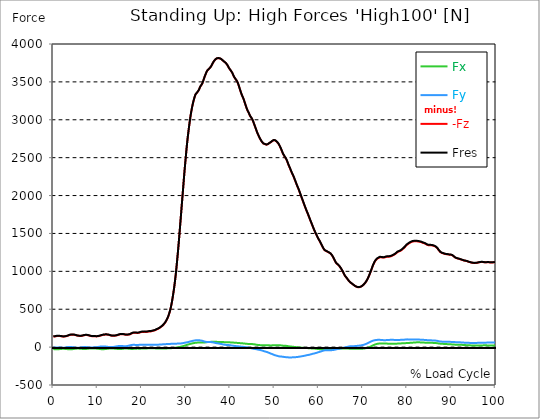
| Category |  Fx |  Fy |  -Fz |  Fres |
|---|---|---|---|---|
| 0.0 | -25.821 | -8.707 | 138.574 | 141.735 |
| 0.167348456675344 | -27.02 | -7.235 | 139.146 | 142.389 |
| 0.334696913350688 | -27.96 | -5.791 | 140.332 | 143.656 |
| 0.5020453700260321 | -28.519 | -5.164 | 142.648 | 146.027 |
| 0.669393826701376 | -29.064 | -4.537 | 144.965 | 148.385 |
| 0.83674228337672 | -29.064 | -3.992 | 145.55 | 148.902 |
| 1.0040907400520642 | -28.437 | -3.665 | 146.177 | 149.352 |
| 1.1621420602454444 | -27.769 | -3.652 | 146.668 | 149.652 |
| 1.3294905169207885 | -26.897 | -4.442 | 146.722 | 149.529 |
| 1.4968389735961325 | -25.521 | -5.873 | 145.755 | 148.385 |
| 1.6641874302714765 | -24.445 | -6.867 | 144.665 | 147.186 |
| 1.8315358869468206 | -23.6 | -7.903 | 142.798 | 145.346 |
| 1.9988843436221646 | -22.932 | -8.761 | 140.795 | 143.411 |
| 2.1662328002975086 | -22.687 | -8.802 | 139.283 | 141.885 |
| 2.333581256972853 | -22.837 | -8.162 | 138.56 | 141.108 |
| 2.5009297136481967 | -23.314 | -6.976 | 139.528 | 142.062 |
| 2.6682781703235405 | -23.75 | -5.6 | 141.408 | 143.915 |
| 2.8356266269988843 | -24.567 | -3.856 | 143.329 | 145.959 |
| 3.002975083674229 | -25.603 | -2.207 | 145.441 | 148.207 |
| 3.1703235403495724 | -26.734 | -0.763 | 147.853 | 150.715 |
| 3.337671997024917 | -28.069 | 0.804 | 151.805 | 154.83 |
| 3.4957233172182973 | -29.255 | 2.017 | 156.41 | 159.585 |
| 3.663071773893641 | -29.677 | 2.589 | 159.721 | 162.978 |
| 3.8304202305689854 | -29.582 | 2.425 | 162.256 | 165.444 |
| 3.997768687244329 | -28.914 | 1.567 | 163.509 | 166.589 |
| 4.165117143919673 | -28.11 | 0.6 | 164.422 | 167.352 |
| 4.332465600595017 | -27.115 | -0.586 | 164.831 | 167.611 |
| 4.499814057270361 | -25.794 | -2.139 | 164.409 | 167.038 |
| 4.667162513945706 | -24.363 | -3.911 | 163.468 | 165.962 |
| 4.834510970621049 | -22.823 | -5.845 | 161.493 | 163.877 |
| 5.001859427296393 | -21.447 | -7.59 | 158.945 | 161.288 |
| 5.169207883971737 | -20.616 | -8.584 | 156.001 | 158.345 |
| 5.336556340647081 | -19.798 | -9.334 | 152.922 | 155.266 |
| 5.503904797322425 | -19.485 | -9.415 | 151.042 | 153.385 |
| 5.671253253997769 | -19.553 | -9.075 | 149.516 | 151.846 |
| 5.82930457419115 | -20.03 | -8.175 | 148.357 | 150.674 |
| 5.996653030866494 | -20.684 | -7.031 | 147.499 | 149.829 |
| 6.164001487541838 | -21.529 | -5.573 | 147.513 | 149.897 |
| 6.331349944217181 | -22.333 | -4.183 | 148.248 | 150.728 |
| 6.498698400892526 | -23.45 | -2.439 | 149.774 | 152.391 |
| 6.66604685756787 | -24.499 | -0.981 | 152.282 | 155.061 |
| 6.833395314243213 | -25.085 | 0.164 | 154.898 | 157.909 |
| 7.000743770918558 | -25.576 | 1.226 | 157.446 | 160.661 |
| 7.168092227593902 | -25.548 | 1.54 | 158.727 | 161.915 |
| 7.335440684269246 | -24.813 | 1.049 | 159.367 | 162.419 |
| 7.50278914094459 | -23.395 | -0.191 | 159.544 | 162.392 |
| 7.6701375976199335 | -22.183 | -1.581 | 158.658 | 161.37 |
| 7.837486054295278 | -20.997 | -3.27 | 156.846 | 159.462 |
| 7.995537374488658 | -19.921 | -4.551 | 154.557 | 157.037 |
| 8.162885831164003 | -18.667 | -5.9 | 151.164 | 153.631 |
| 8.330234287839346 | -17.768 | -6.677 | 148.357 | 150.824 |
| 8.49758274451469 | -17.55 | -6.554 | 146.518 | 149.011 |
| 8.664931201190035 | -17.754 | -5.805 | 144.406 | 146.913 |
| 8.832279657865378 | -18.041 | -4.919 | 143.343 | 145.932 |
| 8.999628114540721 | -18.599 | -3.597 | 142.962 | 145.632 |
| 9.166976571216066 | -19.43 | -2.194 | 143.616 | 146.3 |
| 9.334325027891412 | -19.975 | -1.349 | 144.678 | 147.376 |
| 9.501673484566755 | -19.621 | -1.812 | 143.316 | 145.959 |
| 9.669021941242098 | -19.798 | -1.935 | 141.476 | 144.201 |
| 9.836370397917442 | -20.643 | -0.559 | 141.476 | 144.351 |
| 10.003718854592787 | -21.447 | 0.967 | 142.58 | 145.55 |
| 10.17106731126813 | -22.442 | 2.562 | 144.324 | 147.404 |
| 10.329118631461512 | -23.627 | 4.278 | 146.45 | 149.679 |
| 10.496467088136853 | -25.031 | 5.873 | 149.093 | 152.486 |
| 10.663815544812199 | -26.488 | 7.276 | 152.05 | 155.661 |
| 10.831164001487544 | -27.129 | 7.971 | 154.979 | 158.658 |
| 10.998512458162887 | -27.701 | 8.666 | 157.718 | 161.452 |
| 11.16586091483823 | -27.974 | 9.129 | 160.253 | 164 |
| 11.333209371513574 | -27.715 | 9.061 | 162.337 | 166.016 |
| 11.50055782818892 | -27.197 | 8.761 | 163.932 | 167.488 |
| 11.667906284864264 | -26.121 | 7.903 | 164.667 | 168.019 |
| 11.835254741539607 | -25.071 | 7.14 | 165.212 | 168.374 |
| 12.00260319821495 | -23.94 | 6.132 | 165.553 | 168.523 |
| 12.169951654890292 | -22.701 | 4.851 | 165.308 | 168.087 |
| 12.337300111565641 | -21.297 | 3.161 | 164.395 | 167.011 |
| 12.504648568240984 | -19.962 | 1.376 | 162.555 | 165.076 |
| 12.662699888434362 | -19.103 | 0.3 | 159.435 | 161.969 |
| 12.830048345109708 | -18.558 | -0.082 | 155.811 | 158.318 |
| 12.997396801785053 | -18.204 | -0.245 | 152.772 | 155.252 |
| 13.164745258460396 | -18.163 | 0.095 | 151.192 | 153.631 |
| 13.33209371513574 | -18.299 | 0.749 | 150.497 | 152.881 |
| 13.499442171811083 | -18.831 | 1.826 | 150.415 | 152.813 |
| 13.666790628486426 | -19.567 | 3.039 | 150.728 | 153.181 |
| 13.834139085161771 | -20.275 | 4.592 | 151.287 | 153.849 |
| 14.001487541837117 | -21.106 | 6.159 | 151.587 | 154.298 |
| 14.16883599851246 | -22.142 | 7.944 | 152.908 | 155.797 |
| 14.336184455187803 | -23.355 | 9.906 | 155.048 | 158.154 |
| 14.503532911863147 | -24.622 | 11.895 | 157.609 | 160.975 |
| 14.670881368538492 | -25.794 | 13.476 | 161.016 | 164.627 |
| 14.828932688731873 | -26.475 | 14.511 | 164.436 | 168.128 |
| 14.996281145407215 | -26.502 | 14.988 | 167.365 | 170.99 |
| 15.163629602082558 | -26.039 | 15.356 | 169.314 | 172.816 |
| 15.330978058757903 | -25.112 | 15.22 | 170.486 | 173.769 |
| 15.498326515433247 | -23.913 | 14.62 | 170.99 | 174.015 |
| 15.665674972108594 | -22.428 | 13.585 | 170.744 | 173.511 |
| 15.833023428783937 | -20.807 | 12.304 | 169.723 | 172.175 |
| 16.00037188545928 | -19.757 | 11.732 | 167.938 | 170.254 |
| 16.167720342134626 | -19.09 | 11.487 | 165.962 | 168.196 |
| 16.335068798809967 | -18.722 | 11.541 | 164.136 | 166.343 |
| 16.502417255485312 | -18.817 | 12.359 | 163.291 | 165.58 |
| 16.669765712160658 | -19.294 | 13.953 | 163.455 | 165.948 |
| 16.837114168836 | -19.975 | 15.983 | 164.068 | 166.834 |
| 17.004462625511344 | -20.793 | 18.259 | 165.185 | 168.292 |
| 17.16251394570472 | -21.692 | 20.738 | 166.684 | 170.172 |
| 17.32986240238007 | -22.728 | 23.15 | 168.837 | 172.734 |
| 17.497210859055414 | -23.736 | 25.644 | 172.829 | 177.162 |
| 17.664559315730756 | -24.213 | 28.178 | 179.601 | 184.234 |
| 17.8319077724061 | -24.118 | 29.5 | 183.703 | 188.417 |
| 17.999256229081443 | -23.75 | 30.222 | 186.891 | 191.592 |
| 18.166604685756788 | -23.218 | 30.317 | 188.649 | 193.282 |
| 18.333953142432133 | -22.455 | 29.936 | 189.48 | 194.017 |
| 18.501301599107478 | -21.338 | 28.928 | 189.507 | 193.867 |
| 18.668650055782823 | -20.616 | 28.396 | 188.104 | 192.382 |
| 18.835998512458165 | -19.975 | 27.974 | 186.564 | 190.774 |
| 19.00334696913351 | -19.676 | 28.164 | 186.537 | 190.693 |
| 19.170695425808855 | -19.853 | 28.873 | 187.954 | 192.11 |
| 19.338043882484197 | -20.234 | 29.704 | 189.439 | 193.677 |
| 19.496095202677576 | -20.098 | 30.345 | 192.246 | 196.579 |
| 19.66344365935292 | -20.262 | 31.585 | 195.448 | 200.054 |
| 19.830792116028263 | -20.016 | 32.307 | 198.037 | 202.792 |
| 19.998140572703612 | -19.076 | 31.775 | 199.999 | 204.659 |
| 20.165489029378953 | -18.64 | 31.476 | 200.285 | 204.877 |
| 20.3328374860543 | -18.695 | 31.694 | 200.163 | 204.782 |
| 20.500185942729644 | -18.967 | 32.239 | 201.212 | 205.844 |
| 20.667534399404985 | -18.041 | 31.489 | 201.253 | 205.776 |
| 20.83488285608033 | -17.386 | 30.821 | 200.803 | 205.245 |
| 21.002231312755672 | -17.059 | 30.494 | 200.421 | 204.823 |
| 21.16957976943102 | -16.76 | 30.89 | 201.416 | 205.94 |
| 21.336928226106362 | -16.651 | 31.694 | 203.119 | 207.82 |
| 21.504276682781704 | -16.882 | 32.375 | 205.708 | 210.545 |
| 21.67162513945705 | -16.637 | 32.17 | 207.493 | 212.235 |
| 21.82967645965043 | -16.351 | 31.353 | 207.384 | 211.922 |
| 21.997024916325774 | -16.078 | 30.535 | 207.262 | 211.595 |
| 22.16437337300112 | -16.215 | 30.699 | 208.365 | 212.63 |
| 22.33172182967646 | -16.501 | 31.285 | 212.044 | 216.377 |
| 22.499070286351806 | -16.337 | 31.462 | 215.26 | 219.552 |
| 22.666418743027148 | -16.296 | 31.353 | 217.658 | 221.909 |
| 22.833767199702496 | -16.256 | 31.244 | 220.056 | 224.253 |
| 23.00111565637784 | -16.487 | 30.985 | 222.768 | 226.855 |
| 23.168464113053183 | -16.978 | 31.353 | 227.005 | 231.093 |
| 23.335812569728528 | -18.013 | 32.47 | 233.382 | 237.593 |
| 23.50316102640387 | -18.64 | 32.92 | 238.914 | 243.125 |
| 23.670509483079215 | -18.19 | 32.061 | 241.353 | 245.359 |
| 23.83785793975456 | -18.531 | 32.634 | 246.613 | 250.619 |
| 23.995909259947936 | -18.981 | 33.424 | 252.322 | 256.382 |
| 24.163257716623285 | -19.389 | 34.255 | 258.44 | 262.528 |
| 24.330606173298627 | -19.43 | 35.168 | 267.051 | 271.18 |
| 24.49795462997397 | -19.267 | 35.645 | 274.287 | 278.374 |
| 24.665303086649313 | -19.09 | 36.122 | 281.508 | 285.569 |
| 24.83265154332466 | -19.022 | 37.226 | 291.864 | 295.856 |
| 25.0 | -18.722 | 38.016 | 302.669 | 306.566 |
| 25.167348456675345 | -18.299 | 38.615 | 313.624 | 317.412 |
| 25.334696913350694 | -17.823 | 39.038 | 328.531 | 332.183 |
| 25.502045370026035 | -17.359 | 39.46 | 344.895 | 348.411 |
| 25.669393826701377 | -16.964 | 40.06 | 362.745 | 366.124 |
| 25.836742283376722 | -16.378 | 40.264 | 383.92 | 387.135 |
| 26.004090740052067 | -15.724 | 40.373 | 408.419 | 411.457 |
| 26.17143919672741 | -15.234 | 40.7 | 437.619 | 440.467 |
| 26.329490516920792 | -14.757 | 41.599 | 469.435 | 472.133 |
| 26.49683897359613 | -14.566 | 42.649 | 507.069 | 509.645 |
| 26.66418743027148 | -14.062 | 43.63 | 552.062 | 554.487 |
| 26.831535886946828 | -12.958 | 44.393 | 603.717 | 605.965 |
| 26.998884343622166 | -11.541 | 44.706 | 662.553 | 664.61 |
| 27.166232800297514 | -10.614 | 44.965 | 725.708 | 727.602 |
| 27.333581256972852 | -10.056 | 45.36 | 793.456 | 795.213 |
| 27.5009297136482 | -8.979 | 45.646 | 870.373 | 871.995 |
| 27.668278170323543 | -7.222 | 45.783 | 954.526 | 955.997 |
| 27.835626626998888 | -5.464 | 45.851 | 1049.17 | 1050.492 |
| 28.002975083674233 | -4.006 | 46.014 | 1151.65 | 1152.849 |
| 28.170323540349575 | -2.834 | 46.532 | 1256.228 | 1257.318 |
| 28.33767199702492 | -1.363 | 47.172 | 1367.986 | 1368.994 |
| 28.50502045370026 | 0.64 | 47.881 | 1484.214 | 1485.154 |
| 28.663071773893645 | 2.889 | 47.976 | 1606.641 | 1607.514 |
| 28.830420230568986 | 5.45 | 48.467 | 1727.747 | 1728.565 |
| 28.99776868724433 | 7.876 | 49.598 | 1849.766 | 1850.584 |
| 29.165117143919673 | 10.192 | 51.124 | 1970.422 | 1971.253 |
| 29.33246560059502 | 12.795 | 53.386 | 2089.607 | 2090.465 |
| 29.499814057270367 | 15.983 | 55.334 | 2213.465 | 2214.364 |
| 29.66716251394571 | 19.103 | 57.133 | 2331.151 | 2332.091 |
| 29.834510970621054 | 22.046 | 58.618 | 2438.713 | 2439.68 |
| 30.00185942729639 | 25.398 | 60.825 | 2545.457 | 2546.492 |
| 30.169207883971744 | 28.764 | 62.883 | 2649.762 | 2650.866 |
| 30.33655634064708 | 31.939 | 64.981 | 2741.791 | 2742.976 |
| 30.50390479732243 | 35.127 | 67.502 | 2824.88 | 2826.161 |
| 30.671253253997772 | 37.934 | 69.709 | 2903.106 | 2904.455 |
| 30.829304574191156 | 40.509 | 72.026 | 2976.154 | 2977.584 |
| 30.996653030866494 | 43.085 | 74.901 | 3042.934 | 3044.446 |
| 31.164001487541842 | 45.796 | 77.871 | 3102.328 | 3103.936 |
| 31.331349944217187 | 48.29 | 80.256 | 3155.06 | 3156.75 |
| 31.498698400892525 | 50.32 | 82.327 | 3202.123 | 3203.868 |
| 31.666046857567874 | 52.105 | 84.425 | 3242.442 | 3244.241 |
| 31.833395314243212 | 53.863 | 86.415 | 3278.687 | 3280.553 |
| 32.00074377091856 | 55.729 | 88.022 | 3311.157 | 3313.078 |
| 32.1680922275939 | 57.283 | 90.066 | 3336.61 | 3338.613 |
| 32.33544068426925 | 58.291 | 91.034 | 3348.069 | 3350.099 |
| 32.50278914094459 | 59.136 | 91.456 | 3358.738 | 3360.796 |
| 32.670137597619934 | 59.79 | 91.293 | 3368.998 | 3371.056 |
| 32.83748605429528 | 60.185 | 90.557 | 3386.33 | 3388.347 |
| 33.004834510970625 | 60.444 | 89.63 | 3406.851 | 3408.826 |
| 33.162885831164004 | 60.553 | 88.499 | 3430.995 | 3432.93 |
| 33.33023428783935 | 60.757 | 87.396 | 3447.891 | 3449.785 |
| 33.497582744514695 | 60.648 | 85.665 | 3462.089 | 3463.915 |
| 33.664931201190036 | 60.471 | 83.594 | 3477.909 | 3479.667 |
| 33.83227965786538 | 60.771 | 80.746 | 3504.275 | 3505.951 |
| 33.99962811454073 | 60.771 | 76.577 | 3533.107 | 3534.688 |
| 34.16697657121607 | 61.289 | 72.067 | 3561.912 | 3563.424 |
| 34.33432502789141 | 62.188 | 70.704 | 3587.733 | 3589.232 |
| 34.50167348456676 | 63.85 | 70.009 | 3612.014 | 3613.54 |
| 34.6690219412421 | 64.968 | 68.224 | 3634.374 | 3635.886 |
| 34.83637039791744 | 66.603 | 68.224 | 3650.697 | 3652.237 |
| 35.00371885459279 | 67.448 | 68.469 | 3659.976 | 3661.543 |
| 35.17106731126814 | 68.388 | 67.911 | 3670.877 | 3672.458 |
| 35.338415767943474 | 68.796 | 67.475 | 3681.192 | 3682.772 |
| 35.49646708813686 | 69.042 | 67.134 | 3691.166 | 3692.76 |
| 35.6638155448122 | 69.342 | 66.344 | 3704.914 | 3706.481 |
| 35.831164001487544 | 69.723 | 65.077 | 3723.323 | 3724.876 |
| 35.998512458162885 | 70.377 | 63.305 | 3742.617 | 3744.143 |
| 36.165860914838234 | 71.113 | 61.452 | 3759.744 | 3761.257 |
| 36.333209371513576 | 71.576 | 59.313 | 3775.319 | 3776.804 |
| 36.50055782818892 | 71.563 | 56.615 | 3788.045 | 3789.489 |
| 36.667906284864266 | 70.759 | 54.19 | 3797.965 | 3799.368 |
| 36.83525474153961 | 69.832 | 52.105 | 3804.641 | 3805.99 |
| 37.002603198214956 | 68.906 | 50.933 | 3811.073 | 3812.381 |
| 37.1699516548903 | 68.483 | 49.693 | 3813.389 | 3814.683 |
| 37.337300111565646 | 68.142 | 47.99 | 3813.566 | 3814.833 |
| 37.50464856824098 | 68.238 | 46.532 | 3812.571 | 3813.839 |
| 37.66269988843437 | 68.265 | 44.842 | 3809.656 | 3810.909 |
| 37.83004834510971 | 68.183 | 42.717 | 3805.077 | 3806.331 |
| 37.99739680178505 | 67.965 | 40.591 | 3799.055 | 3800.308 |
| 38.16474525846039 | 67.393 | 38.479 | 3790.77 | 3791.997 |
| 38.33209371513574 | 66.289 | 36.217 | 3780.905 | 3782.091 |
| 38.49944217181109 | 65.635 | 34.282 | 3772.689 | 3773.861 |
| 38.666790628486424 | 65.513 | 32.688 | 3764.868 | 3766.026 |
| 38.83413908516178 | 65.281 | 31.012 | 3756.883 | 3758.041 |
| 39.001487541837115 | 64.913 | 29.282 | 3748.735 | 3749.879 |
| 39.16883599851246 | 64.532 | 28.124 | 3736.267 | 3737.398 |
| 39.336184455187805 | 64.082 | 27.51 | 3722.614 | 3723.759 |
| 39.503532911863154 | 63.796 | 27.02 | 3706.331 | 3707.462 |
| 39.670881368538495 | 63.074 | 27.292 | 3685.947 | 3687.078 |
| 39.83822982521384 | 62.719 | 25.794 | 3672.362 | 3673.493 |
| 39.996281145407224 | 62.501 | 24.158 | 3659.2 | 3660.331 |
| 40.163629602082565 | 62.215 | 22.442 | 3645.792 | 3646.923 |
| 40.33097805875791 | 61.616 | 21.093 | 3630.218 | 3631.349 |
| 40.498326515433256 | 60.962 | 19.744 | 3613.594 | 3614.739 |
| 40.6656749721086 | 59.899 | 18.299 | 3590.008 | 3591.153 |
| 40.83302342878393 | 58.795 | 16.732 | 3569.57 | 3570.714 |
| 41.00037188545929 | 57.841 | 15.343 | 3553.205 | 3554.35 |
| 41.16772034213463 | 56.983 | 14.212 | 3539.606 | 3540.751 |
| 41.33506879880997 | 56.383 | 13.081 | 3525.586 | 3526.757 |
| 41.50241725548531 | 55.947 | 11.936 | 3511.319 | 3512.505 |
| 41.66976571216066 | 55.416 | 11.064 | 3492.189 | 3493.374 |
| 41.837114168836 | 54.789 | 10.369 | 3465.046 | 3466.245 |
| 42.004462625511344 | 53.999 | 9.32 | 3435.533 | 3436.718 |
| 42.17181108218669 | 52.813 | 8.189 | 3404.275 | 3405.474 |
| 42.32986240238007 | 51.519 | 6.84 | 3374.026 | 3375.212 |
| 42.497210859055414 | 50.306 | 5.968 | 3344.594 | 3345.766 |
| 42.66455931573076 | 49.829 | 4.987 | 3320.409 | 3321.594 |
| 42.831907772406105 | 49.339 | 4.088 | 3298.062 | 3299.262 |
| 42.999256229081446 | 48.794 | 3.107 | 3274.681 | 3275.88 |
| 43.16660468575679 | 47.268 | 1.54 | 3245.835 | 3247.048 |
| 43.33395314243214 | 46.096 | 0.232 | 3215.708 | 3216.907 |
| 43.50130159910748 | 45.251 | -0.64 | 3186.29 | 3187.503 |
| 43.66865005578282 | 44.27 | -1.553 | 3158.276 | 3159.475 |
| 43.83599851245817 | 42.839 | -2.725 | 3131.692 | 3132.905 |
| 44.00334696913351 | 41.954 | -4.497 | 3110.463 | 3111.689 |
| 44.17069542580886 | 41.518 | -6.69 | 3093.185 | 3094.439 |
| 44.3380438824842 | 40.673 | -8.775 | 3069.531 | 3070.826 |
| 44.49609520267758 | 40.305 | -11.132 | 3049.133 | 3050.455 |
| 44.66344365935292 | 40.373 | -13.394 | 3034.745 | 3036.134 |
| 44.83079211602827 | 40.033 | -15.901 | 3020.683 | 3022.154 |
| 44.99814057270361 | 39.678 | -17.918 | 3001.811 | 3003.337 |
| 45.16548902937895 | 39.147 | -19.689 | 2979.71 | 2981.263 |
| 45.332837486054295 | 37.553 | -21.665 | 2952.268 | 2953.835 |
| 45.500185942729644 | 36.067 | -23.232 | 2926.025 | 2927.619 |
| 45.66753439940499 | 34.5 | -25.044 | 2899.836 | 2901.457 |
| 45.83488285608033 | 32.388 | -27.006 | 2872.516 | 2874.178 |
| 46.00223131275568 | 30.413 | -29.023 | 2844.992 | 2846.682 |
| 46.16957976943102 | 28.982 | -31.149 | 2820.575 | 2822.332 |
| 46.336928226106366 | 27.837 | -32.974 | 2798.842 | 2800.64 |
| 46.50427668278171 | 27.02 | -34.896 | 2777.068 | 2778.907 |
| 46.671625139457056 | 26.284 | -37.157 | 2757.338 | 2759.218 |
| 46.829676459650436 | 25.576 | -39.324 | 2739.134 | 2741.041 |
| 46.99702491632577 | 24.826 | -41.545 | 2722.224 | 2724.145 |
| 47.16437337300112 | 23.913 | -44.788 | 2707.603 | 2709.525 |
| 47.33172182967646 | 23.137 | -48.194 | 2694.564 | 2696.498 |
| 47.49907028635181 | 23.014 | -51.492 | 2686.238 | 2688.16 |
| 47.66641874302716 | 23.327 | -54.626 | 2681.946 | 2683.854 |
| 47.83376719970249 | 23.573 | -57.787 | 2678.908 | 2680.856 |
| 48.001115656377834 | 23.695 | -60.062 | 2674.561 | 2676.537 |
| 48.16846411305319 | 23.763 | -62.529 | 2671.332 | 2673.362 |
| 48.33581256972853 | 23.954 | -65.717 | 2673.457 | 2675.501 |
| 48.50316102640387 | 24.186 | -68.851 | 2677.913 | 2679.943 |
| 48.67050948307921 | 24.363 | -72.898 | 2682.982 | 2684.998 |
| 48.837857939754564 | 23.382 | -77.381 | 2691.934 | 2694.032 |
| 49.005206396429905 | 22.374 | -81.904 | 2701.131 | 2703.352 |
| 49.163257716623285 | 22.36 | -85.624 | 2704.034 | 2706.323 |
| 49.33060617329863 | 22.85 | -89.058 | 2710.806 | 2713.19 |
| 49.49795462997397 | 23.3 | -92.669 | 2719.676 | 2722.183 |
| 49.66530308664932 | 23.314 | -96.47 | 2727.81 | 2730.427 |
| 49.832651543324666 | 22.987 | -100.831 | 2731.013 | 2733.751 |
| 50.0 | 22.932 | -105.164 | 2730.318 | 2733.193 |
| 50.16734845667534 | 23.613 | -108.189 | 2727.156 | 2730.154 |
| 50.33469691335069 | 23.804 | -110.668 | 2718.381 | 2721.461 |
| 50.50204537002604 | 24.744 | -113.394 | 2710.737 | 2713.912 |
| 50.66939382670139 | 25.685 | -116.337 | 2700.968 | 2704.211 |
| 50.836742283376715 | 25.276 | -118.64 | 2688.418 | 2691.77 |
| 51.00409074005207 | 24.717 | -121.283 | 2673.553 | 2677.027 |
| 51.17143919672741 | 24.145 | -123.3 | 2654.736 | 2658.292 |
| 51.32949051692079 | 23.477 | -124.553 | 2634.651 | 2638.248 |
| 51.496838973596134 | 22.564 | -125.139 | 2612.073 | 2615.684 |
| 51.66418743027148 | 21.134 | -125.589 | 2587.206 | 2590.844 |
| 51.831535886946824 | 19.185 | -126.529 | 2563.116 | 2566.849 |
| 51.99888434362217 | 18.313 | -128.45 | 2542.636 | 2546.465 |
| 52.16623280029752 | 17.972 | -130.33 | 2525.986 | 2529.923 |
| 52.33358125697285 | 17.645 | -131.434 | 2510.439 | 2514.445 |
| 52.5009297136482 | 17.209 | -132.034 | 2495.014 | 2499.061 |
| 52.668278170323546 | 16.419 | -132.933 | 2477.669 | 2481.756 |
| 52.835626626998895 | 14.92 | -133.969 | 2456.113 | 2460.228 |
| 53.00297508367424 | 13.094 | -134.895 | 2430.224 | 2434.393 |
| 53.17032354034958 | 11.487 | -135.794 | 2404.662 | 2408.899 |
| 53.33767199702492 | 10.069 | -136.271 | 2381.525 | 2385.804 |
| 53.50502045370027 | 9.129 | -135.794 | 2359.383 | 2363.648 |
| 53.663071773893655 | 7.93 | -135.767 | 2334.871 | 2339.163 |
| 53.83042023056899 | 6.813 | -135.863 | 2310.549 | 2314.868 |
| 53.99776868724433 | 5.559 | -135.399 | 2288.734 | 2293.053 |
| 54.16511714391967 | 4.633 | -134.759 | 2268.281 | 2272.587 |
| 54.33246560059503 | 3.556 | -134.732 | 2247.393 | 2251.699 |
| 54.49981405727037 | 2.33 | -133.928 | 2221.899 | 2226.178 |
| 54.667162513945705 | 1.145 | -133.533 | 2196.951 | 2201.256 |
| 54.834510970621054 | -0.259 | -132.606 | 2171.389 | 2175.694 |
| 55.0018594272964 | -1.526 | -131.203 | 2145.881 | 2150.132 |
| 55.169207883971744 | -2.398 | -129.799 | 2121.219 | 2125.415 |
| 55.336556340647086 | -3.188 | -128.832 | 2098.886 | 2103.069 |
| 55.50390479732243 | -4.101 | -127.455 | 2074.564 | 2078.693 |
| 55.671253253997776 | -5.123 | -125.861 | 2048.443 | 2052.517 |
| 55.83860171067312 | -5.995 | -124.403 | 2021.532 | 2025.566 |
| 55.9966530308665 | -6.622 | -122.864 | 1994.635 | 1998.628 |
| 56.16400148754184 | -7.385 | -120.997 | 1967.67 | 1971.594 |
| 56.33134994421718 | -8.026 | -118.898 | 1941.74 | 1945.582 |
| 56.498698400892536 | -8.72 | -117.236 | 1914.87 | 1918.658 |
| 56.66604685756788 | -9.688 | -115.506 | 1887.809 | 1891.556 |
| 56.83339531424321 | -10.723 | -113.38 | 1861.402 | 1865.081 |
| 57.00074377091856 | -11.418 | -111.404 | 1835.786 | 1839.397 |
| 57.16809222759391 | -11.773 | -109.088 | 1810.674 | 1814.203 |
| 57.33544068426925 | -12.672 | -106.649 | 1785.929 | 1789.363 |
| 57.5027891409446 | -13.312 | -105.055 | 1763.379 | 1766.771 |
| 57.670137597619934 | -13.966 | -102.847 | 1738.512 | 1741.836 |
| 57.83748605429528 | -14.539 | -101.417 | 1712.895 | 1716.193 |
| 58.004834510970625 | -15.234 | -99.005 | 1687.987 | 1691.217 |
| 58.16288583116401 | -16.215 | -96.075 | 1663.434 | 1666.554 |
| 58.330234287839346 | -16.937 | -93.228 | 1639.275 | 1642.3 |
| 58.497582744514695 | -17.713 | -90.489 | 1614.313 | 1617.242 |
| 58.66493120119004 | -18.259 | -87.859 | 1589.487 | 1592.334 |
| 58.832279657865385 | -18.504 | -85.624 | 1565.137 | 1567.931 |
| 58.999628114540734 | -19.131 | -83.621 | 1541.756 | 1544.508 |
| 59.16697657121607 | -20.139 | -81.046 | 1519.886 | 1522.584 |
| 59.33432502789142 | -21.42 | -78.198 | 1499.284 | 1501.914 |
| 59.50167348456676 | -23.068 | -75.705 | 1479.023 | 1481.598 |
| 59.66902194124211 | -24.09 | -72.639 | 1458.529 | 1461.037 |
| 59.83637039791745 | -25.153 | -69.124 | 1438.132 | 1440.557 |
| 60.00371885459278 | -26.352 | -65.84 | 1420.282 | 1422.612 |
| 60.17106731126813 | -27.647 | -62.801 | 1404.871 | 1407.106 |
| 60.33841576794349 | -27.81 | -60.267 | 1385.822 | 1387.962 |
| 60.49646708813685 | -27.892 | -57.228 | 1366.624 | 1368.722 |
| 60.6638155448122 | -27.892 | -54.013 | 1347.479 | 1349.564 |
| 60.831164001487544 | -27.756 | -50.579 | 1327.286 | 1329.343 |
| 60.99851245816289 | -27.674 | -47.227 | 1308.687 | 1310.744 |
| 61.16586091483824 | -27.456 | -44.638 | 1292.431 | 1294.502 |
| 61.333209371513576 | -27.551 | -42.581 | 1279.024 | 1281.122 |
| 61.50055782818892 | -28.028 | -40.659 | 1270.644 | 1272.728 |
| 61.667906284864266 | -27.919 | -40.591 | 1268.3 | 1270.398 |
| 61.835254741539615 | -27.238 | -41.245 | 1265.343 | 1267.469 |
| 62.002603198214956 | -26.325 | -42.144 | 1258.571 | 1260.765 |
| 62.16995165489029 | -26.107 | -42.294 | 1252.521 | 1254.729 |
| 62.33730011156564 | -26.298 | -41.995 | 1247.671 | 1249.878 |
| 62.504648568240995 | -26.475 | -41.708 | 1242.697 | 1244.918 |
| 62.67199702491633 | -26.107 | -41.654 | 1235.217 | 1237.465 |
| 62.83004834510971 | -25.535 | -40.537 | 1224.166 | 1226.455 |
| 62.99739680178505 | -24.922 | -39.719 | 1211.249 | 1213.565 |
| 63.1647452584604 | -24.24 | -38.793 | 1195.402 | 1197.719 |
| 63.33209371513575 | -23.6 | -37.921 | 1177.784 | 1180.1 |
| 63.4994421718111 | -22.728 | -36.326 | 1158.708 | 1161.011 |
| 63.666790628486424 | -21.801 | -33.86 | 1137.929 | 1140.191 |
| 63.83413908516177 | -21.202 | -31.258 | 1120.079 | 1122.314 |
| 64.00148754183712 | -20.861 | -28.6 | 1105.554 | 1107.761 |
| 64.16883599851248 | -20.752 | -26.597 | 1095.076 | 1097.242 |
| 64.3361844551878 | -20.766 | -24.622 | 1089.843 | 1091.996 |
| 64.50353291186315 | -20.602 | -22.81 | 1082.336 | 1084.448 |
| 64.6708813685385 | -20.207 | -21.188 | 1069.146 | 1071.244 |
| 64.83822982521384 | -19.635 | -19.512 | 1054.934 | 1057.046 |
| 65.00557828188919 | -19.076 | -17.7 | 1040.981 | 1043.066 |
| 65.16362960208257 | -18.831 | -15.261 | 1025.598 | 1027.655 |
| 65.3309780587579 | -18.545 | -12.999 | 1009.083 | 1011.073 |
| 65.49832651543326 | -18.204 | -10.505 | 990.675 | 992.61 |
| 65.6656749721086 | -18.286 | -7.44 | 969.95 | 971.803 |
| 65.83302342878395 | -18.34 | -4.428 | 950.901 | 952.673 |
| 66.00037188545929 | -18.422 | -1.717 | 935.463 | 937.194 |
| 66.16772034213463 | -18.722 | 0.286 | 922.737 | 924.427 |
| 66.33506879880998 | -19.022 | 1.621 | 911.537 | 913.213 |
| 66.50241725548531 | -19.226 | 3.679 | 897.72 | 899.355 |
| 66.66976571216065 | -19.73 | 5.954 | 884.735 | 886.356 |
| 66.83711416883601 | -20.016 | 7.903 | 872.335 | 873.929 |
| 67.00446262551135 | -20.302 | 9.797 | 861.203 | 862.756 |
| 67.1718110821867 | -20.766 | 10.941 | 852.414 | 853.9 |
| 67.32986240238007 | -21.161 | 10.846 | 844.825 | 846.228 |
| 67.49721085905541 | -21.719 | 10.737 | 838.053 | 839.388 |
| 67.66455931573076 | -21.992 | 11.868 | 831.158 | 832.439 |
| 67.83190777240611 | -22.019 | 12.617 | 823.037 | 824.264 |
| 67.99925622908145 | -22.142 | 12.209 | 815.284 | 816.456 |
| 68.16660468575678 | -22.237 | 13.271 | 808.73 | 809.861 |
| 68.33395314243214 | -21.951 | 14.362 | 801.536 | 802.639 |
| 68.50130159910749 | -22.319 | 15.411 | 797.639 | 798.729 |
| 68.66865005578282 | -22.401 | 16.147 | 794.246 | 795.309 |
| 68.83599851245816 | -21.856 | 16.923 | 791.412 | 792.447 |
| 69.00334696913352 | -22.046 | 18.204 | 791.425 | 792.475 |
| 69.17069542580886 | -21.951 | 19.512 | 791.466 | 792.516 |
| 69.3380438824842 | -21.869 | 20.698 | 792.815 | 793.864 |
| 69.50539233915956 | -21.61 | 22.074 | 796.712 | 797.802 |
| 69.66344365935292 | -21.215 | 23.777 | 801.59 | 802.694 |
| 69.83079211602826 | -20.698 | 25.685 | 808.158 | 809.289 |
| 69.99814057270362 | -19.948 | 27.837 | 815.938 | 817.096 |
| 70.16548902937896 | -19.185 | 30.494 | 825.503 | 826.716 |
| 70.33283748605429 | -17.904 | 33.615 | 835.627 | 836.922 |
| 70.50018594272964 | -16.065 | 37.089 | 847.346 | 848.722 |
| 70.667534399405 | -14.157 | 41.191 | 861.108 | 862.62 |
| 70.83488285608033 | -11.936 | 45.578 | 876.573 | 878.262 |
| 71.00223131275568 | -9.197 | 50.088 | 893.769 | 895.663 |
| 71.16957976943102 | -5.941 | 54.844 | 913.54 | 915.665 |
| 71.33692822610637 | -2.425 | 59.831 | 935.368 | 937.793 |
| 71.50427668278171 | 1.335 | 64.736 | 958.777 | 961.53 |
| 71.67162513945706 | 5.709 | 69.437 | 983.549 | 986.615 |
| 71.8389735961324 | 10.642 | 74.26 | 1009.043 | 1012.504 |
| 71.99702491632577 | 15.056 | 78.444 | 1034.673 | 1038.488 |
| 72.16437337300113 | 19.839 | 82.981 | 1062.524 | 1066.72 |
| 72.33172182967647 | 24.431 | 86.251 | 1086.11 | 1090.606 |
| 72.49907028635181 | 28.805 | 88.813 | 1107.693 | 1112.435 |
| 72.66641874302715 | 32.933 | 90.802 | 1126.347 | 1131.293 |
| 72.8337671997025 | 36.721 | 92.464 | 1142.207 | 1147.33 |
| 73.00111565637783 | 39.733 | 93.759 | 1154.266 | 1159.566 |
| 73.16846411305319 | 42.144 | 94.944 | 1163.872 | 1169.309 |
| 73.33581256972853 | 44.011 | 95.939 | 1170.549 | 1176.122 |
| 73.50316102640387 | 45.565 | 96.293 | 1176.272 | 1181.94 |
| 73.67050948307921 | 47.036 | 96.47 | 1181.736 | 1187.472 |
| 73.83785793975457 | 46.777 | 95.803 | 1185.592 | 1191.342 |
| 74.00520639642991 | 46.736 | 95.012 | 1186.777 | 1192.568 |
| 74.16325771662328 | 47.118 | 94.1 | 1184.502 | 1190.32 |
| 74.33060617329863 | 47.39 | 93.228 | 1182.444 | 1188.33 |
| 74.49795462997398 | 47.445 | 92.437 | 1180.945 | 1186.9 |
| 74.66530308664932 | 47.295 | 91.81 | 1180.754 | 1186.763 |
| 74.83265154332466 | 46.954 | 91.347 | 1181.79 | 1187.826 |
| 75.00000000000001 | 46.805 | 91.347 | 1184.474 | 1190.551 |
| 75.16734845667534 | 46.9 | 92.056 | 1189.257 | 1195.389 |
| 75.3346969133507 | 46.682 | 92.682 | 1192.623 | 1198.795 |
| 75.50204537002605 | 46.096 | 93.296 | 1192.841 | 1198.972 |
| 75.66939382670138 | 45.456 | 93.895 | 1192.636 | 1198.713 |
| 75.83674228337672 | 45.074 | 94.563 | 1193.059 | 1199.095 |
| 76.00409074005208 | 44.761 | 95.244 | 1193.685 | 1199.681 |
| 76.17143919672742 | 44.529 | 95.844 | 1195.947 | 1201.902 |
| 76.33878765340276 | 44.325 | 96.416 | 1198.659 | 1204.559 |
| 76.49683897359614 | 44.216 | 96.443 | 1202.828 | 1208.674 |
| 76.66418743027148 | 44.147 | 96.198 | 1207.734 | 1213.524 |
| 76.83153588694682 | 44.434 | 95.83 | 1212.83 | 1218.607 |
| 76.99888434362218 | 44.979 | 95.38 | 1218.089 | 1223.88 |
| 77.16623280029752 | 44.924 | 95.639 | 1223.553 | 1229.412 |
| 77.33358125697285 | 44.897 | 94.59 | 1230.884 | 1236.716 |
| 77.5009297136482 | 45.006 | 93.337 | 1238.351 | 1244.142 |
| 77.66827817032356 | 45.687 | 93.418 | 1246.431 | 1252.249 |
| 77.83562662699889 | 46.287 | 94.181 | 1255.192 | 1261.038 |
| 78.00297508367423 | 46.736 | 95.271 | 1260.629 | 1266.542 |
| 78.17032354034959 | 48.085 | 94.903 | 1263.34 | 1269.295 |
| 78.33767199702493 | 48.712 | 95.053 | 1266.134 | 1272.143 |
| 78.50502045370027 | 48.821 | 95.707 | 1271.379 | 1277.457 |
| 78.67236891037561 | 49.107 | 96.28 | 1278.41 | 1284.556 |
| 78.83042023056899 | 49.966 | 96.743 | 1286.191 | 1292.418 |
| 78.99776868724433 | 50.81 | 96.906 | 1294.966 | 1301.274 |
| 79.16511714391969 | 50.919 | 97.547 | 1302.705 | 1309.068 |
| 79.33246560059503 | 51.097 | 98.037 | 1311.998 | 1318.456 |
| 79.49981405727036 | 51.274 | 99.236 | 1322.326 | 1328.921 |
| 79.66716251394571 | 52.555 | 101.471 | 1334.262 | 1341.089 |
| 79.83451097062107 | 53.154 | 102.112 | 1344.809 | 1351.717 |
| 80.00185942729641 | 53.672 | 102.221 | 1351.976 | 1358.911 |
| 80.16920788397174 | 54.408 | 102.098 | 1359.511 | 1366.487 |
| 80.33655634064709 | 54.844 | 101.103 | 1365.656 | 1372.646 |
| 80.50390479732243 | 55.443 | 100.449 | 1373.355 | 1380.372 |
| 80.67125325399778 | 56.397 | 100.436 | 1380.29 | 1387.308 |
| 80.83860171067312 | 56.928 | 99.972 | 1383.738 | 1390.741 |
| 80.99665303086651 | 57.732 | 99.414 | 1387.648 | 1394.638 |
| 81.16400148754184 | 58.591 | 99.931 | 1392.049 | 1399.121 |
| 81.3313499442172 | 59.327 | 100.054 | 1393.235 | 1400.306 |
| 81.49869840089255 | 59.926 | 100.245 | 1395.592 | 1402.718 |
| 81.66604685756786 | 60.498 | 100.504 | 1397.363 | 1404.517 |
| 81.83339531424322 | 61.33 | 100.436 | 1398.058 | 1405.225 |
| 82.00074377091858 | 62.352 | 100.136 | 1397.445 | 1404.599 |
| 82.16809222759392 | 63.06 | 99.686 | 1396.273 | 1403.413 |
| 82.33544068426926 | 62.924 | 99.509 | 1395.115 | 1402.214 |
| 82.50278914094459 | 62.897 | 99.359 | 1393.385 | 1400.456 |
| 82.67013759761994 | 62.924 | 99.25 | 1391.259 | 1398.303 |
| 82.83748605429528 | 63.006 | 99.005 | 1389.569 | 1396.546 |
| 83.00483451097062 | 62.297 | 98.31 | 1387.675 | 1394.529 |
| 83.17218296764597 | 61.534 | 97.833 | 1385.427 | 1392.158 |
| 83.33023428783935 | 61.221 | 97.043 | 1381.489 | 1388.125 |
| 83.4975827445147 | 61.003 | 96.007 | 1376.897 | 1383.424 |
| 83.66493120119004 | 60.785 | 95.735 | 1373.832 | 1380.263 |
| 83.83227965786537 | 59.735 | 95.639 | 1370.82 | 1377.143 |
| 83.99962811454073 | 58.604 | 95.149 | 1366.923 | 1373.109 |
| 84.16697657121607 | 57.787 | 94.181 | 1361.8 | 1367.836 |
| 84.33432502789142 | 57.501 | 93.078 | 1355.777 | 1361.718 |
| 84.50167348456677 | 57.269 | 91.606 | 1350.082 | 1355.9 |
| 84.6690219412421 | 57.01 | 90.761 | 1346.812 | 1352.548 |
| 84.83637039791745 | 56.765 | 90.066 | 1344.345 | 1350.014 |
| 85.0037188545928 | 56.561 | 89.821 | 1344.441 | 1350.027 |
| 85.17106731126813 | 56.356 | 89.576 | 1344.523 | 1350.041 |
| 85.33841576794349 | 56.152 | 89.317 | 1344.563 | 1350.014 |
| 85.50576422461883 | 56.234 | 88.963 | 1343.378 | 1348.747 |
| 85.66381554481221 | 56.302 | 88.595 | 1342.193 | 1347.493 |
| 85.83116400148755 | 55.62 | 87.886 | 1339.399 | 1344.591 |
| 85.99851245816289 | 54.925 | 87.178 | 1336.62 | 1341.688 |
| 86.16586091483823 | 54.776 | 86.851 | 1332.546 | 1337.56 |
| 86.33320937151358 | 54.639 | 86.537 | 1328.458 | 1333.404 |
| 86.50055782818893 | 53.631 | 85.447 | 1322.149 | 1326.945 |
| 86.66790628486427 | 52.405 | 84.18 | 1313.551 | 1318.211 |
| 86.83525474153961 | 51.069 | 82.422 | 1303.877 | 1308.346 |
| 87.00260319821496 | 49.325 | 79.697 | 1290.537 | 1294.748 |
| 87.16995165489031 | 47.377 | 76.89 | 1276.544 | 1280.481 |
| 87.33730011156564 | 46.219 | 75.201 | 1264.28 | 1268.055 |
| 87.504648568241 | 45.129 | 73.688 | 1254.361 | 1257.985 |
| 87.67199702491634 | 44.434 | 72.653 | 1247.507 | 1251.036 |
| 87.83004834510972 | 43.889 | 72.189 | 1243.024 | 1246.485 |
| 87.99739680178506 | 43.439 | 72.039 | 1239.781 | 1243.215 |
| 88.1647452584604 | 42.676 | 71.494 | 1236.961 | 1240.326 |
| 88.33209371513574 | 41.681 | 70.895 | 1232.914 | 1236.198 |
| 88.49944217181108 | 40.945 | 70.69 | 1229.685 | 1232.928 |
| 88.66679062848644 | 40.537 | 70.677 | 1227.654 | 1230.884 |
| 88.83413908516178 | 40.073 | 70.799 | 1226.278 | 1229.48 |
| 89.00148754183712 | 39.596 | 70.922 | 1225.515 | 1228.704 |
| 89.16883599851246 | 38.847 | 70.173 | 1223.744 | 1226.864 |
| 89.33618445518782 | 38.329 | 69.859 | 1222.994 | 1226.074 |
| 89.50353291186315 | 37.348 | 69.451 | 1220.242 | 1223.267 |
| 89.6708813685385 | 37.062 | 69.355 | 1219.602 | 1222.586 |
| 89.83822982521386 | 36.762 | 69.164 | 1219.043 | 1222.013 |
| 90.00557828188919 | 36.258 | 68.742 | 1217.503 | 1220.419 |
| 90.16362960208257 | 35.277 | 67.938 | 1213.756 | 1216.618 |
| 90.3309780587579 | 34.201 | 67.012 | 1206.78 | 1209.546 |
| 90.49832651543326 | 33.26 | 66.221 | 1198.672 | 1201.37 |
| 90.66567497210859 | 33.111 | 66.099 | 1188.671 | 1191.383 |
| 90.83302342878395 | 32.77 | 65.99 | 1182.689 | 1185.374 |
| 91.00037188545929 | 32.089 | 65.513 | 1178.043 | 1180.7 |
| 91.16772034213463 | 31.775 | 65.09 | 1173.315 | 1175.945 |
| 91.33506879880998 | 31.298 | 64.573 | 1170.59 | 1173.165 |
| 91.50241725548533 | 31.298 | 64.286 | 1168.042 | 1170.576 |
| 91.66976571216065 | 31.639 | 64.096 | 1165.971 | 1168.478 |
| 91.83711416883601 | 31.285 | 63.551 | 1163.136 | 1165.616 |
| 92.00446262551137 | 30.862 | 62.842 | 1158.722 | 1161.147 |
| 92.1718110821867 | 30.331 | 62.188 | 1156.051 | 1158.408 |
| 92.33915953886203 | 29.772 | 61.561 | 1153.094 | 1155.397 |
| 92.49721085905541 | 29.255 | 60.73 | 1149.96 | 1152.181 |
| 92.66455931573077 | 28.778 | 59.803 | 1145.941 | 1148.094 |
| 92.83190777240611 | 28.233 | 59.081 | 1142.63 | 1144.728 |
| 92.99925622908145 | 27.51 | 58.591 | 1140.449 | 1142.493 |
| 93.1666046857568 | 26.679 | 58.114 | 1139.319 | 1141.308 |
| 93.33395314243214 | 25.821 | 57.596 | 1138.215 | 1140.163 |
| 93.50130159910749 | 25.344 | 57.719 | 1134.877 | 1136.811 |
| 93.66865005578283 | 25.003 | 57.801 | 1130.121 | 1132.042 |
| 93.83599851245818 | 24.281 | 56.928 | 1126.905 | 1128.786 |
| 94.00334696913353 | 23.736 | 56.165 | 1123.908 | 1125.747 |
| 94.17069542580886 | 23.218 | 55.348 | 1121.373 | 1123.158 |
| 94.3380438824842 | 22.85 | 55.021 | 1117.858 | 1119.643 |
| 94.50539233915954 | 22.224 | 54.667 | 1115.691 | 1117.463 |
| 94.66344365935292 | 21.651 | 54.435 | 1113.62 | 1115.392 |
| 94.83079211602828 | 21.27 | 54.639 | 1111.767 | 1113.552 |
| 94.99814057270362 | 20.97 | 54.776 | 1110.228 | 1112.012 |
| 95.16548902937897 | 20.984 | 54.707 | 1109.642 | 1111.44 |
| 95.33283748605432 | 20.984 | 54.639 | 1109.069 | 1110.868 |
| 95.50018594272963 | 20.875 | 54.925 | 1110.718 | 1112.53 |
| 95.66753439940499 | 20.875 | 55.307 | 1112.353 | 1114.193 |
| 95.83488285608034 | 21.311 | 55.811 | 1112.98 | 1114.833 |
| 96.00223131275567 | 21.61 | 56.302 | 1115.051 | 1116.918 |
| 96.16957976943102 | 21.842 | 56.806 | 1117.79 | 1119.67 |
| 96.33692822610638 | 22.333 | 56.751 | 1119.52 | 1121.401 |
| 96.50427668278171 | 22.823 | 56.71 | 1121.251 | 1123.131 |
| 96.67162513945706 | 22.728 | 56.792 | 1123.295 | 1125.189 |
| 96.8389735961324 | 22.592 | 56.738 | 1124.603 | 1126.483 |
| 96.99702491632577 | 22.687 | 56.71 | 1123.976 | 1125.856 |
| 97.16437337300111 | 22.932 | 56.888 | 1122.191 | 1124.099 |
| 97.33172182967647 | 23.096 | 57.201 | 1120.379 | 1122.3 |
| 97.49907028635181 | 23.109 | 57.582 | 1119.112 | 1121.046 |
| 97.66641874302715 | 23.123 | 58.1 | 1118.948 | 1120.91 |
| 97.8337671997025 | 23.096 | 58.673 | 1118.962 | 1120.965 |
| 98.00111565637785 | 22.932 | 59.395 | 1119.629 | 1121.646 |
| 98.16846411305319 | 22.769 | 59.94 | 1120.147 | 1122.205 |
| 98.33581256972855 | 22.605 | 59.735 | 1120.147 | 1122.205 |
| 98.50316102640389 | 22.51 | 59.803 | 1119.425 | 1121.482 |
| 98.67050948307921 | 22.592 | 59.858 | 1117.953 | 1120.024 |
| 98.83785793975456 | 22.714 | 59.844 | 1117.122 | 1119.207 |
| 99.0052063964299 | 22.66 | 59.803 | 1117.136 | 1119.221 |
| 99.17255485310525 | 22.36 | 60.321 | 1116.931 | 1119.043 |
| 99.33060617329863 | 22.374 | 60.131 | 1117.258 | 1119.384 |
| 99.49795462997399 | 22.292 | 60.076 | 1118.553 | 1120.665 |
| 99.66530308664933 | 21.951 | 60.526 | 1121.305 | 1123.445 |
| 99.83265154332467 | 22.183 | 60.676 | 1121.428 | 1123.567 |
| 100.0 | 22.305 | 61.125 | 1122.395 | 1124.562 |